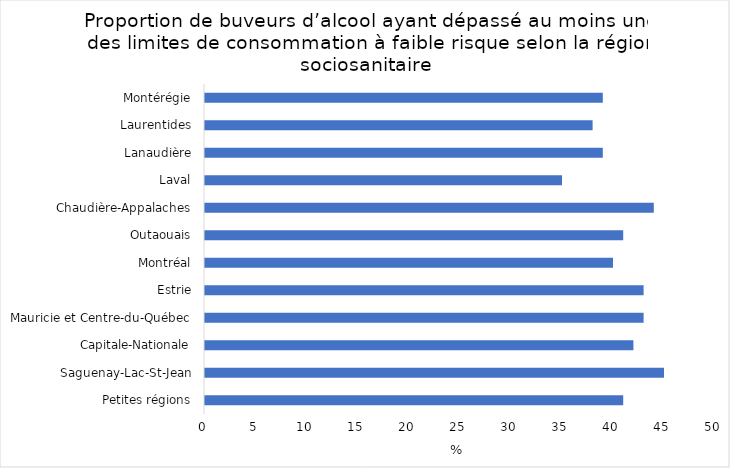
| Category | Series 0 |
|---|---|
| Petites régions | 41 |
| Saguenay-Lac-St-Jean | 45 |
| Capitale-Nationale | 42 |
| Mauricie et Centre-du-Québec | 43 |
| Estrie | 43 |
| Montréal | 40 |
| Outaouais | 41 |
| Chaudière-Appalaches | 44 |
| Laval | 35 |
| Lanaudière | 39 |
| Laurentides | 38 |
| Montérégie | 39 |